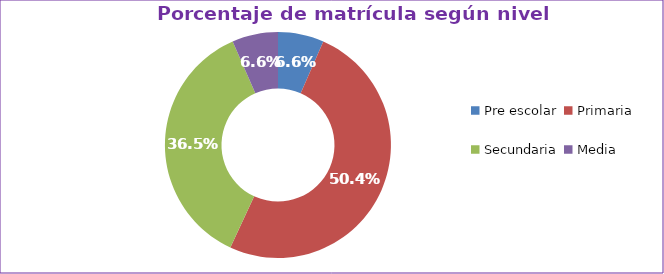
| Category | Series 0 |
|---|---|
| Pre escolar | 0.066 |
| Primaria | 0.504 |
| Secundaria | 0.365 |
| Media | 0.066 |